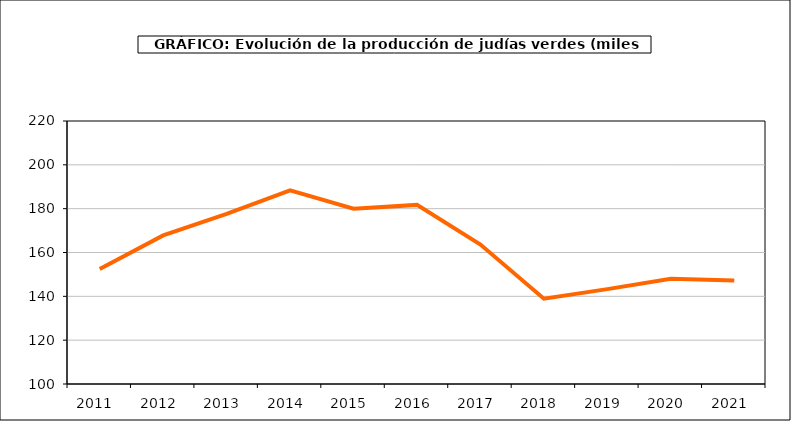
| Category | producción |
|---|---|
| 2011.0 | 152.507 |
| 2012.0 | 167.816 |
| 2013.0 | 177.588 |
| 2014.0 | 188.38 |
| 2015.0 | 179.947 |
| 2016.0 | 181.725 |
| 2017.0 | 163.649 |
| 2018.0 | 138.925 |
| 2019.0 | 143.289 |
| 2020.0 | 148.016 |
| 2021.0 | 147.216 |